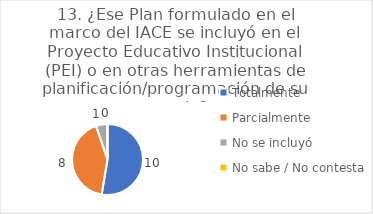
| Category | 13. ¿Ese Plan formulado en el marco del IACE se incluyó en el Proyecto Educativo Institucional (PEI) o en otras herramientas de planificación/programación de su escuela? |
|---|---|
| Totalmente  | 0.526 |
| Parcialmente  | 0.421 |
| No se incluyó  | 0.053 |
| No sabe / No contesta | 0 |